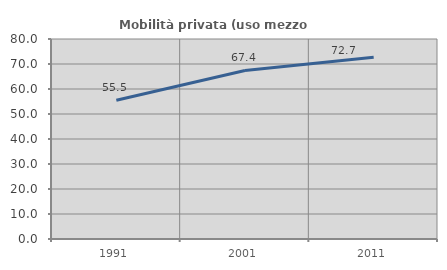
| Category | Mobilità privata (uso mezzo privato) |
|---|---|
| 1991.0 | 55.5 |
| 2001.0 | 67.42 |
| 2011.0 | 72.718 |